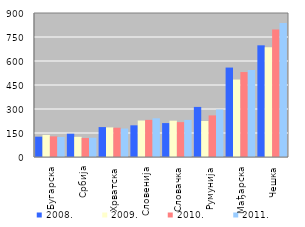
| Category | 2008. | 2009. | 2010. | 2011. |
|---|---|---|---|---|
| Бугарска | 127 | 138 | 129 | 125 |
| Србија | 145.483 | 126.108 | 118.456 | 120.56 |
| Хрватска | 187 | 185 | 183 | 178 |
| Словенија | 198 | 228 | 232 | 242 |
| Словачка | 212 | 227 | 218 | 232 |
| Румунија | 313 | 225 | 260 | 297 |
| Мађарска | 559 | 484 | 531 | 544 |
| Чешка | 698 | 686 | 797 | 837 |